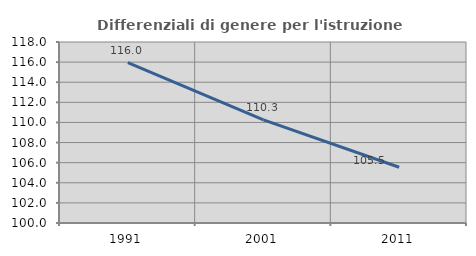
| Category | Differenziali di genere per l'istruzione superiore |
|---|---|
| 1991.0 | 115.959 |
| 2001.0 | 110.261 |
| 2011.0 | 105.543 |